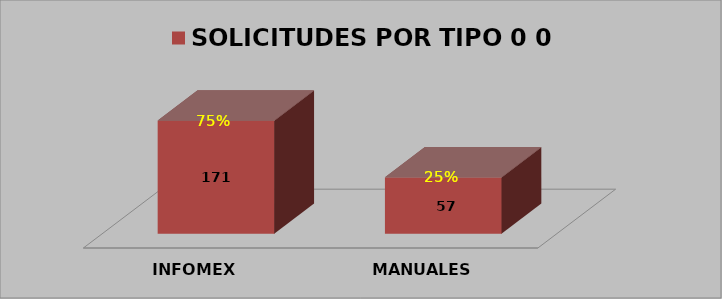
| Category | SOLICITUDES POR TIPO 0 0 0 |
|---|---|
| INFOMEX | 0.666 |
| MANUALES | 0.331 |